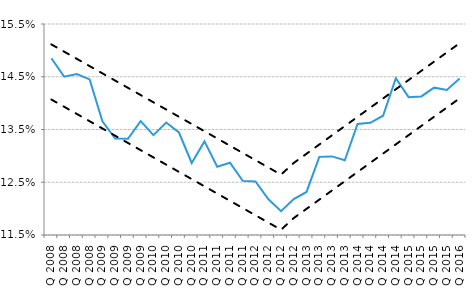
| Category | EDS | Dolny interval | Horny interval |
|---|---|---|---|
| 1 Q 2008 | 0.149 | 0.141 | 0.151 |
| 2 Q 2008 | 0.145 | 0.139 | 0.15 |
| 3 Q 2008 | 0.146 | 0.138 | 0.148 |
| 4 Q 2008 | 0.144 | 0.137 | 0.147 |
| 1 Q 2009 | 0.137 | 0.135 | 0.146 |
| 2 Q 2009 | 0.133 | 0.134 | 0.144 |
| 3 Q 2009 | 0.133 | 0.132 | 0.143 |
| 4 Q 2009 | 0.137 | 0.131 | 0.142 |
| 1 Q 2010 | 0.134 | 0.13 | 0.14 |
| 2 Q 2010 | 0.136 | 0.128 | 0.139 |
| 3 Q 2010 | 0.134 | 0.127 | 0.137 |
| 4 Q 2010 | 0.129 | 0.126 | 0.136 |
| 1 Q 2011 | 0.133 | 0.124 | 0.135 |
| 2 Q 2011 | 0.128 | 0.123 | 0.133 |
| 3 Q 2011 | 0.129 | 0.121 | 0.132 |
| 4 Q 2011 | 0.125 | 0.12 | 0.131 |
| 1 Q 2012 | 0.125 | 0.119 | 0.129 |
| 2 Q 2012 | 0.122 | 0.117 | 0.128 |
| 3 Q 2012 | 0.12 | 0.116 | 0.126 |
| 4 Q 2012 | 0.122 | 0.118 | 0.129 |
| 1 Q 2013 | 0.123 | 0.12 | 0.13 |
| 2 Q 2013 | 0.13 | 0.122 | 0.132 |
| 3 Q 2013 | 0.13 | 0.123 | 0.134 |
| 4 Q 2013 | 0.129 | 0.125 | 0.136 |
| 1 Q 2014 | 0.136 | 0.127 | 0.137 |
| 2 Q 2014 | 0.136 | 0.129 | 0.139 |
| 3 Q 2014 | 0.138 | 0.13 | 0.141 |
| 4 Q 2014 | 0.145 | 0.132 | 0.143 |
| 1 Q 2015 | 0.141 | 0.134 | 0.144 |
| 2 Q 2015 | 0.141 | 0.136 | 0.146 |
| 3 Q 2015 | 0.143 | 0.137 | 0.148 |
| 4 Q 2015 | 0.142 | 0.139 | 0.15 |
| 1 Q 2016 | 0.145 | 0.141 | 0.151 |